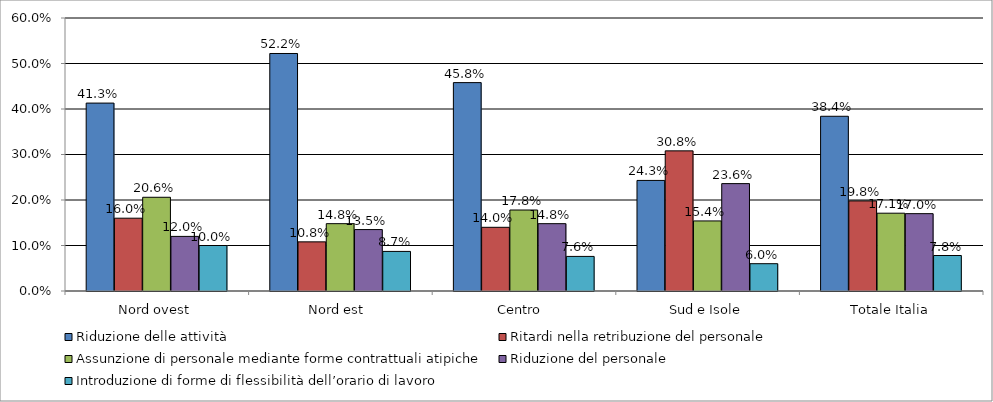
| Category | Riduzione delle attività | Ritardi nella retribuzione del personale | Assunzione di personale mediante forme contrattuali atipiche | Riduzione del personale | Introduzione di forme di flessibilità dell’orario di lavoro |
|---|---|---|---|---|---|
| Nord ovest | 0.413 | 0.16 | 0.206 | 0.12 | 0.1 |
| Nord est  | 0.522 | 0.108 | 0.148 | 0.135 | 0.087 |
| Centro  | 0.458 | 0.14 | 0.178 | 0.148 | 0.076 |
| Sud e Isole | 0.243 | 0.308 | 0.154 | 0.236 | 0.06 |
| Totale Italia | 0.384 | 0.198 | 0.171 | 0.17 | 0.078 |